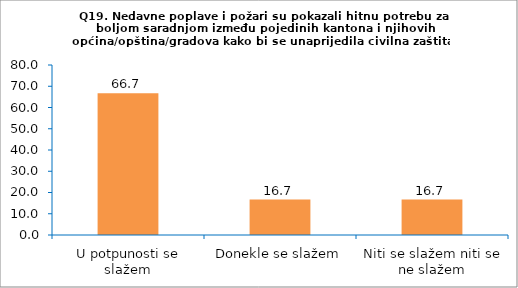
| Category | Series 0 |
|---|---|
| U potpunosti se slažem | 66.667 |
| Donekle se slažem | 16.667 |
| Niti se slažem niti se ne slažem | 16.667 |